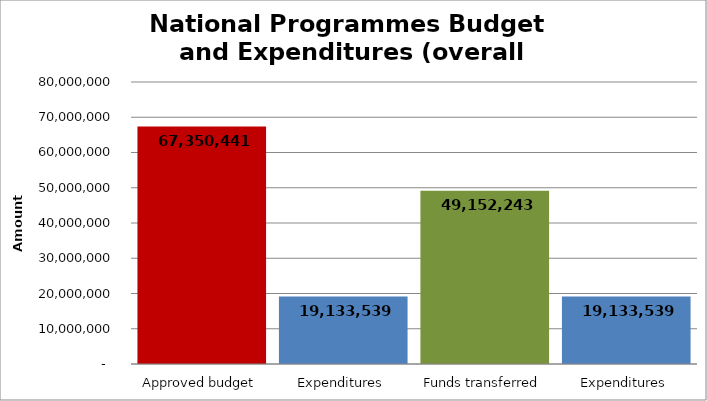
| Category | Series 0 |
|---|---|
| Approved budget | 67350441 |
| Expenditures | 19133538.63 |
| Funds transferred | 49152243 |
| Expenditures | 19133538.63 |